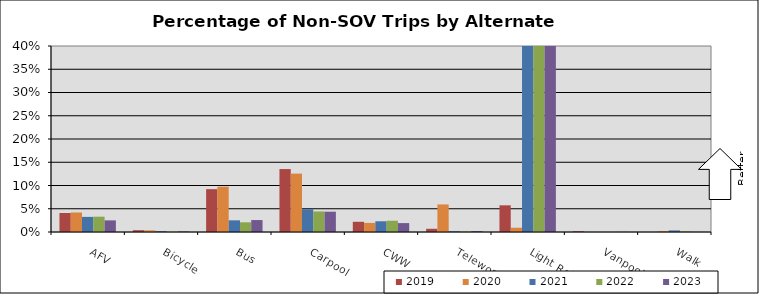
| Category | 2019 | 2020 | 2021 | 2022 | 2023 |
|---|---|---|---|---|---|
| AFV | 0.041 | 0.042 | 0.033 | 0.033 | 0.025 |
| Bicycle | 0.004 | 0.004 | 0.002 | 0 | 0.001 |
| Bus | 0.092 | 0.097 | 0.025 | 0.021 | 0.026 |
| Carpool | 0.135 | 0.126 | 0.049 | 0.044 | 0.044 |
| CWW | 0.022 | 0.02 | 0.023 | 0.024 | 0.019 |
| Telework | 0.007 | 0.059 | 0.002 | 0.001 | 0.002 |
| Light Rail | 0.057 | 0.009 | 0.465 | 0.49 | 0.558 |
| Vanpool | 0.002 | 0 | 0 | 0 | 0 |
| Walk | 0 | 0.002 | 0.003 | 0.001 | 0 |